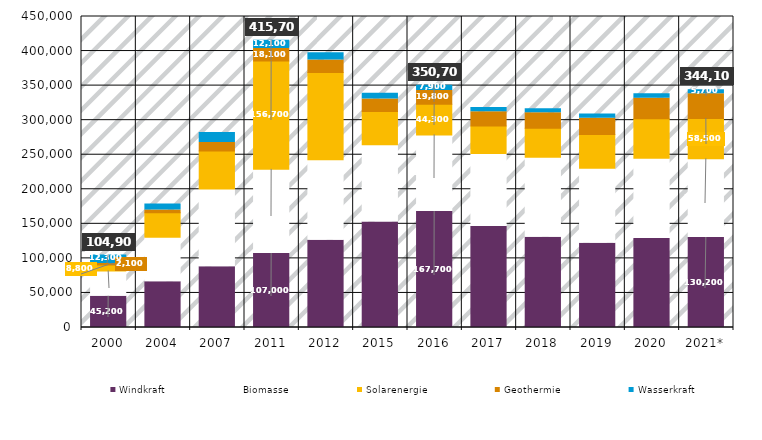
| Category | Windkraft | Biomasse | Solarenergie | Geothermie | Wasserkraft |
|---|---|---|---|---|---|
| 2000 | 45200 | 36500 | 8800 | 2100 | 12300 |
| 2004 | 66200 | 64500 | 35400 | 3800 | 8700 |
| 2007 | 87800 | 112700 | 54800 | 12500 | 14200 |
| 2011 | 107000 | 121800 | 156700 | 18100 | 12100 |
| 2012 | 126400 | 116300 | 126300 | 17900 | 10800 |
| 2015 | 152600 | 112000 | 48000 | 18200 | 8300 |
| 2016 | 167700 | 111000 | 44300 | 19800 | 7900 |
| 2017 | 146200 | 105600 | 39900 | 20500 | 6300 |
| 2018 | 130500 | 115900 | 42000 | 22200 | 5900 |
| 2019 | 122000 | 108400 | 48900 | 23500 | 6200 |
| 2020 | 128800 | 116000 | 57300 | 29700 | 6400 |
| 2021* | 130200 | 113800 | 58500 | 35900 | 5700 |